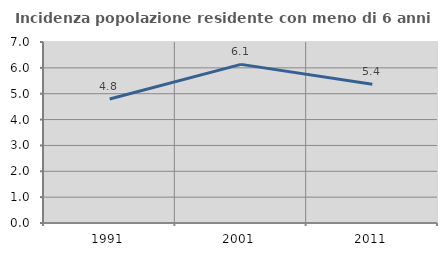
| Category | Incidenza popolazione residente con meno di 6 anni |
|---|---|
| 1991.0 | 4.797 |
| 2001.0 | 6.135 |
| 2011.0 | 5.363 |